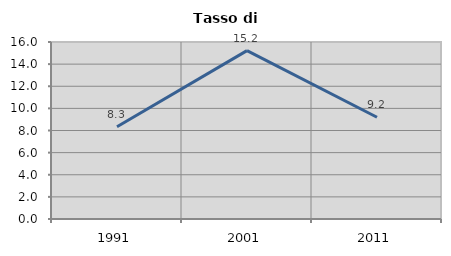
| Category | Tasso di disoccupazione   |
|---|---|
| 1991.0 | 8.333 |
| 2001.0 | 15.217 |
| 2011.0 | 9.195 |